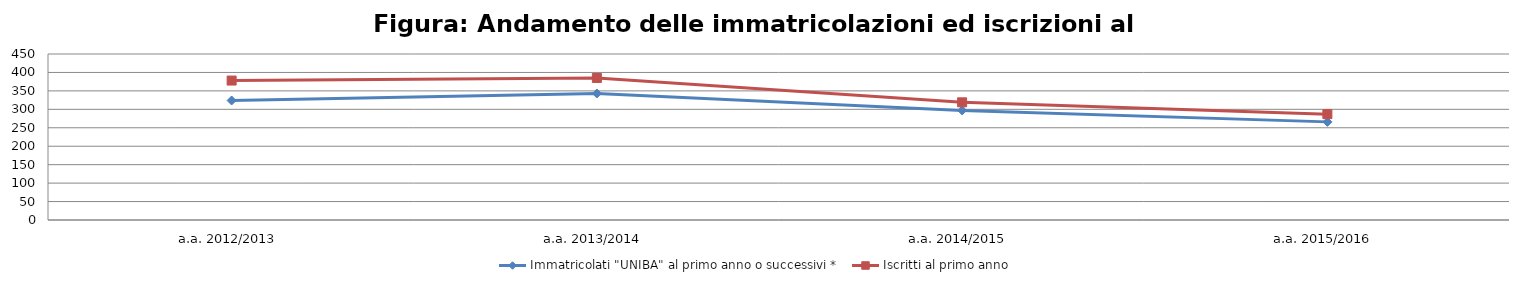
| Category | Immatricolati "UNIBA" al primo anno o successivi * | Iscritti al primo anno  |
|---|---|---|
| a.a. 2012/2013 | 324 | 378 |
| a.a. 2013/2014 | 343 | 385 |
| a.a. 2014/2015 | 297 | 319 |
| a.a. 2015/2016 | 266 | 287 |